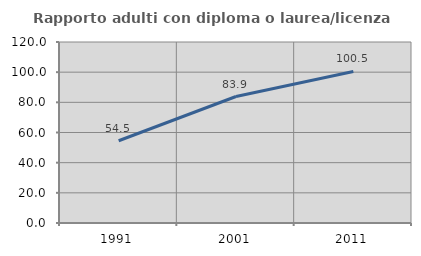
| Category | Rapporto adulti con diploma o laurea/licenza media  |
|---|---|
| 1991.0 | 54.545 |
| 2001.0 | 83.866 |
| 2011.0 | 100.5 |